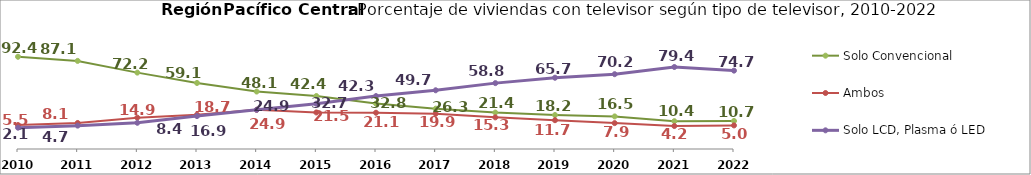
| Category | Solo Convencional | Ambos | Solo LCD, Plasma ó LED |
|---|---|---|---|
| 2010.0 | 92.395 | 5.467 | 2.137 |
| 2011.0 | 87.125 | 8.127 | 4.748 |
| 2012.0 | 72.221 | 14.894 | 8.368 |
| 2013.0 | 59.058 | 18.684 | 16.876 |
| 2014.0 | 48.125 | 24.923 | 24.852 |
| 2015.0 | 42.424 | 21.501 | 32.707 |
| 2016.0 | 32.848 | 21.144 | 42.345 |
| 2017.0 | 26.348 | 19.859 | 49.739 |
| 2018.0 | 21.372 | 15.266 | 58.836 |
| 2019.0 | 18.245 | 11.656 | 65.702 |
| 2020.0 | 16.469 | 7.942 | 70.221 |
| 2021.0 | 10.388 | 4.225 | 79.373 |
| 2022.0 | 10.662 | 5.015 | 74.732 |